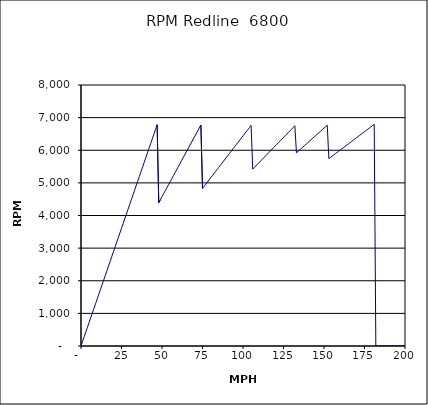
| Category | RPM Redline  6800 |
|---|---|
| 0.0 | 0 |
| 1.0 | 144.311 |
| 2.0 | 288.622 |
| 3.0 | 432.933 |
| 4.0 | 577.244 |
| 5.0 | 721.555 |
| 6.0 | 865.865 |
| 7.0 | 1010.176 |
| 8.0 | 1154.487 |
| 9.0 | 1298.798 |
| 10.0 | 1443.109 |
| 11.0 | 1587.42 |
| 12.0 | 1731.731 |
| 13.0 | 1876.042 |
| 14.0 | 2020.353 |
| 15.0 | 2164.664 |
| 16.0 | 2308.974 |
| 17.0 | 2453.285 |
| 18.0 | 2597.596 |
| 19.0 | 2741.907 |
| 20.0 | 2886.218 |
| 21.0 | 3030.529 |
| 22.0 | 3174.84 |
| 23.0 | 3319.151 |
| 24.0 | 3463.462 |
| 25.0 | 3607.773 |
| 26.0 | 3752.084 |
| 27.0 | 3896.394 |
| 28.0 | 4040.705 |
| 29.0 | 4185.016 |
| 30.0 | 4329.327 |
| 31.0 | 4473.638 |
| 32.0 | 4617.949 |
| 33.0 | 4762.26 |
| 34.0 | 4906.571 |
| 35.0 | 5050.882 |
| 36.0 | 5195.193 |
| 37.0 | 5339.503 |
| 38.0 | 5483.814 |
| 39.0 | 5628.125 |
| 40.0 | 5772.436 |
| 41.0 | 5916.747 |
| 42.0 | 6061.058 |
| 43.0 | 6205.369 |
| 44.0 | 6349.68 |
| 45.0 | 6493.991 |
| 46.0 | 6638.302 |
| 47.0 | 6782.613 |
| 48.0 | 4392.683 |
| 49.0 | 4484.197 |
| 50.0 | 4575.712 |
| 51.0 | 4667.226 |
| 52.0 | 4758.74 |
| 53.0 | 4850.254 |
| 54.0 | 4941.769 |
| 55.0 | 5033.283 |
| 56.0 | 5124.797 |
| 57.0 | 5216.311 |
| 58.0 | 5307.825 |
| 59.0 | 5399.34 |
| 60.0 | 5490.854 |
| 61.0 | 5582.368 |
| 62.0 | 5673.882 |
| 63.0 | 5765.397 |
| 64.0 | 5856.911 |
| 65.0 | 5948.425 |
| 66.0 | 6039.939 |
| 67.0 | 6131.454 |
| 68.0 | 6222.968 |
| 69.0 | 6314.482 |
| 70.0 | 6405.996 |
| 71.0 | 6497.511 |
| 72.0 | 6589.025 |
| 73.0 | 6680.539 |
| 74.0 | 6772.053 |
| 75.0 | 4829.918 |
| 76.0 | 4894.317 |
| 77.0 | 4958.716 |
| 78.0 | 5023.115 |
| 79.0 | 5087.513 |
| 80.0 | 5151.912 |
| 81.0 | 5216.311 |
| 82.0 | 5280.71 |
| 83.0 | 5345.109 |
| 84.0 | 5409.508 |
| 85.0 | 5473.907 |
| 86.0 | 5538.306 |
| 87.0 | 5602.705 |
| 88.0 | 5667.104 |
| 89.0 | 5731.502 |
| 90.0 | 5795.901 |
| 91.0 | 5860.3 |
| 92.0 | 5924.699 |
| 93.0 | 5989.098 |
| 94.0 | 6053.497 |
| 95.0 | 6117.896 |
| 96.0 | 6182.295 |
| 97.0 | 6246.694 |
| 98.0 | 6311.093 |
| 99.0 | 6375.492 |
| 100.0 | 6439.89 |
| 101.0 | 6504.289 |
| 102.0 | 6568.688 |
| 103.0 | 6633.087 |
| 104.0 | 6697.486 |
| 105.0 | 6761.885 |
| 106.0 | 5420.872 |
| 107.0 | 5472.013 |
| 108.0 | 5523.153 |
| 109.0 | 5574.293 |
| 110.0 | 5625.434 |
| 111.0 | 5676.574 |
| 112.0 | 5727.714 |
| 113.0 | 5778.855 |
| 114.0 | 5829.995 |
| 115.0 | 5881.135 |
| 116.0 | 5932.276 |
| 117.0 | 5983.416 |
| 118.0 | 6034.556 |
| 119.0 | 6085.696 |
| 120.0 | 6136.837 |
| 121.0 | 6187.977 |
| 122.0 | 6239.117 |
| 123.0 | 6290.258 |
| 124.0 | 6341.398 |
| 125.0 | 6392.538 |
| 126.0 | 6443.679 |
| 127.0 | 6494.819 |
| 128.0 | 6545.959 |
| 129.0 | 6597.1 |
| 130.0 | 6648.24 |
| 131.0 | 6699.38 |
| 132.0 | 6750.52 |
| 133.0 | 5921.218 |
| 134.0 | 5965.739 |
| 135.0 | 6010.259 |
| 136.0 | 6054.779 |
| 137.0 | 6099.3 |
| 138.0 | 6143.82 |
| 139.0 | 6188.341 |
| 140.0 | 6232.861 |
| 141.0 | 6277.382 |
| 142.0 | 6321.902 |
| 143.0 | 6366.423 |
| 144.0 | 6410.943 |
| 145.0 | 6455.463 |
| 146.0 | 6499.984 |
| 147.0 | 6544.504 |
| 148.0 | 6589.025 |
| 149.0 | 6633.545 |
| 150.0 | 6678.066 |
| 151.0 | 6722.586 |
| 152.0 | 6767.106 |
| 153.0 | 5744.278 |
| 154.0 | 5781.822 |
| 155.0 | 5819.367 |
| 156.0 | 5856.911 |
| 157.0 | 5894.455 |
| 158.0 | 5931.999 |
| 159.0 | 5969.544 |
| 160.0 | 6007.088 |
| 161.0 | 6044.632 |
| 162.0 | 6082.177 |
| 163.0 | 6119.721 |
| 164.0 | 6157.265 |
| 165.0 | 6194.81 |
| 166.0 | 6232.354 |
| 167.0 | 6269.898 |
| 168.0 | 6307.442 |
| 169.0 | 6344.987 |
| 170.0 | 6382.531 |
| 171.0 | 6420.075 |
| 172.0 | 6457.62 |
| 173.0 | 6495.164 |
| 174.0 | 6532.708 |
| 175.0 | 6570.253 |
| 176.0 | 6607.797 |
| 177.0 | 6645.341 |
| 178.0 | 6682.885 |
| 179.0 | 6720.43 |
| 180.0 | 6757.974 |
| 181.0 | 6795.518 |
| 182.0 | 0 |
| 183.0 | 0 |
| 184.0 | 0 |
| 185.0 | 0 |
| 186.0 | 0 |
| 187.0 | 0 |
| 188.0 | 0 |
| 189.0 | 0 |
| 190.0 | 0 |
| 191.0 | 0 |
| 192.0 | 0 |
| 193.0 | 0 |
| 194.0 | 0 |
| 195.0 | 0 |
| 196.0 | 0 |
| 197.0 | 0 |
| 198.0 | 0 |
| 199.0 | 0 |
| 200.0 | 0 |